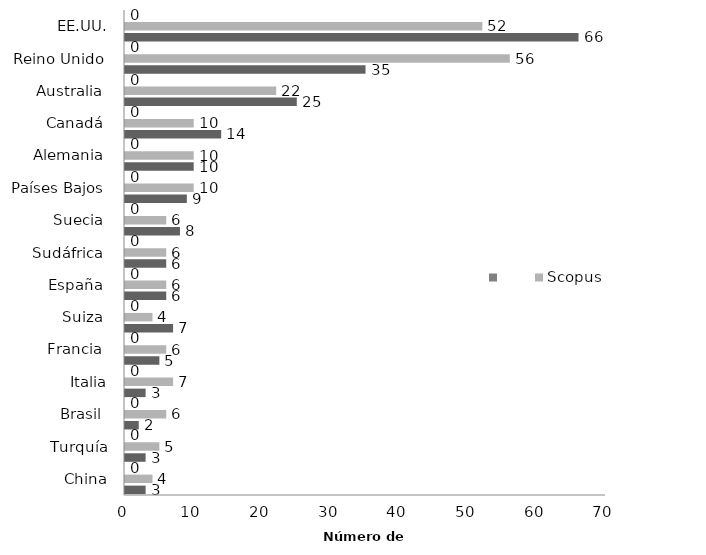
| Category | Web of Science | Scopus | Series 2 |
|---|---|---|---|
| China | 3 | 4 |  |
| Turquía | 3 | 5 |  |
| Brasil  | 2 | 6 |  |
| Italia | 3 | 7 |  |
| Francia  | 5 | 6 |  |
| Suiza  | 7 | 4 |  |
| España  | 6 | 6 |  |
| Sudáfrica  | 6 | 6 |  |
| Suecia  | 8 | 6 |  |
| Países Bajos  | 9 | 10 |  |
| Alemania  | 10 | 10 |  |
| Canadá  | 14 | 10 |  |
| Australia  | 25 | 22 |  |
| Reino Unido  | 35 | 56 |  |
| EE.UU. | 66 | 52 |  |